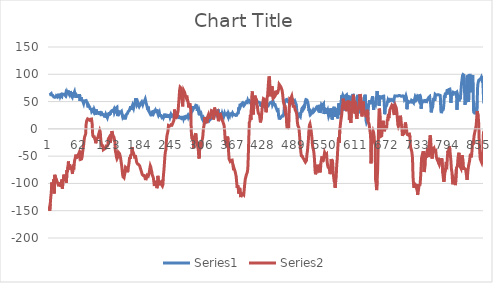
| Category | Series 0 | Series 1 |
|---|---|---|
| 0 | 62.28 | -142.32 |
| 1 | 62.648 | -150.01 |
| 2 | 62.867 | -137.33 |
| 3 | 61.117 | -125.26 |
| 4 | 64.64 | -116.98 |
| 5 | 61.934 | -98.28 |
| 6 | 62.05 | -110.44 |
| 7 | 61.359 | -102.49 |
| 8 | 61.095 | -98.646 |
| 9 | 58.376 | -92.328 |
| 10 | 58.526 | -118.26 |
| 11 | 57.778 | -84.271 |
| 12 | 58.745 | -88.879 |
| 13 | 58.365 | -89.514 |
| 14 | 60.553 | -91.845 |
| 15 | 60.092 | -95.366 |
| 16 | 58.664 | -97.365 |
| 17 | 60.737 | -98.933 |
| 18 | 60.391 | -103.06 |
| 19 | 59.159 | -102.01 |
| 20 | 61.324 | -102.83 |
| 21 | 64.49 | -98.06 |
| 22 | 59.574 | -103.23 |
| 23 | 61.543 | -105.94 |
| 24 | 63.131 | -97.44 |
| 25 | 59.436 | -92.788 |
| 26 | 63.87 | -109.57 |
| 27 | 65.043 | -98.49 |
| 28 | 63.443 | -91.665 |
| 29 | 63.753 | -83.82 |
| 30 | 63.212 | -95.491 |
| 31 | 62.579 | -84.628 |
| 32 | 60.91 | -89.293 |
| 33 | 65.677 | -96.152 |
| 34 | 63.731 | -98.567 |
| 35 | 67.161 | -75.378 |
| 36 | 64.594 | -79.419 |
| 37 | 70.132 | -69.179 |
| 38 | 66.034 | -59.672 |
| 39 | 66.528 | -74.001 |
| 40 | 62.496 | -64.739 |
| 41 | 65.641 | -71.165 |
| 42 | 69.35 | -74.382 |
| 43 | 61.67 | -68.678 |
| 44 | 63.27 | -71.902 |
| 45 | 58.746 | -72.45 |
| 46 | 67.473 | -82.631 |
| 47 | 66.296 | -69.305 |
| 48 | 62.751 | -68.026 |
| 49 | 63.962 | -70.844 |
| 50 | 67.657 | -58.702 |
| 51 | 62.659 | -55.294 |
| 52 | 66 | -51.391 |
| 53 | 56.925 | -47.227 |
| 54 | 61.737 | -54.105 |
| 55 | 61.958 | -50.639 |
| 56 | 59.804 | -51.267 |
| 57 | 59.608 | -48.452 |
| 58 | 60.313 | -46.984 |
| 59 | 57.155 | -43.952 |
| 60 | 63.628 | -49.781 |
| 61 | 51.088 | -47.753 |
| 62 | 54.416 | -55.959 |
| 63 | 58.1 | -57.364 |
| 64 | 53.517 | -55.146 |
| 65 | 52.411 | -51.344 |
| 66 | 51.78 | -43.152 |
| 67 | 50.835 | -36.521 |
| 68 | 46.575 | -29.591 |
| 69 | 50.916 | -20.626 |
| 70 | 51.882 | -14.56 |
| 71 | 51.481 | -12.185 |
| 72 | 50.421 | -9.234 |
| 73 | 51.974 | 8.098 |
| 74 | 49.672 | 14.497 |
| 75 | 46.607 | 15.376 |
| 76 | 47.264 | 18.253 |
| 77 | 39.145 | 17.669 |
| 78 | 43.038 | 17.189 |
| 79 | 43.189 | 16.139 |
| 80 | 39.631 | 15.511 |
| 81 | 36.696 | 14.273 |
| 82 | 37.431 | 15.082 |
| 83 | 35.934 | 20.236 |
| 84 | 31.906 | 15.936 |
| 85 | 31.928 | 8.523 |
| 86 | 34.6 | -11.629 |
| 87 | 33.644 | -13.964 |
| 88 | 31.007 | -13.912 |
| 89 | 35.465 | -14.226 |
| 90 | 33.218 | -18.291 |
| 91 | 26.067 | -20.266 |
| 92 | 29.166 | -26.378 |
| 93 | 35.59 | -22.7 |
| 94 | 30.997 | -17.817 |
| 95 | 30.857 | -17.616 |
| 96 | 28.876 | -16.337 |
| 97 | 29.819 | -14.818 |
| 98 | 28.808 | -9.296 |
| 99 | 25.698 | -9.798 |
| 100 | 32.481 | -2.926 |
| 101 | 33.136 | -5.747 |
| 102 | 26.976 | -20.139 |
| 103 | 26.933 | -26.646 |
| 104 | 28.461 | -30.57 |
| 105 | 26.148 | -30.702 |
| 106 | 25.423 | -30.996 |
| 107 | 26.377 | -38.237 |
| 108 | 26.264 | -39.655 |
| 109 | 22.958 | -36.945 |
| 110 | 24.11 | -36.432 |
| 111 | 22.729 | -35.872 |
| 112 | 26.355 | -33.761 |
| 113 | 24.169 | -31.246 |
| 114 | 24.698 | -31.072 |
| 115 | 20.205 | -31.347 |
| 116 | 23.282 | -29.386 |
| 117 | 28.717 | -18.224 |
| 118 | 24.016 | -16.889 |
| 119 | 30.674 | -15.058 |
| 120 | 25.929 | -18.01 |
| 121 | 27.575 | -24.974 |
| 122 | 31.618 | -23.543 |
| 123 | 30.812 | -12.768 |
| 124 | 33.299 | -4.034 |
| 125 | 32.987 | -4.834 |
| 126 | 32.092 | -12.463 |
| 127 | 32.827 | -11.307 |
| 128 | 35.739 | -14.909 |
| 129 | 30.029 | -19.476 |
| 130 | 31.283 | -25.126 |
| 131 | 34.497 | -41.905 |
| 132 | 37.973 | -44.857 |
| 133 | 36.292 | -52.017 |
| 134 | 39.596 | -54.899 |
| 135 | 25.792 | -54.632 |
| 136 | 25.02 | -50.977 |
| 137 | 25.447 | -42.959 |
| 138 | 27.449 | -44.439 |
| 139 | 31.144 | -45.097 |
| 140 | 32.343 | -48.413 |
| 141 | 30.178 | -52.384 |
| 142 | 28.819 | -52.828 |
| 143 | 32.044 | -65.23 |
| 144 | 27.67 | -72.482 |
| 145 | 23.467 | -81.886 |
| 146 | 26.045 | -87.697 |
| 147 | 19.607 | -89.014 |
| 148 | 21.314 | -89.714 |
| 149 | 19.586 | -90.993 |
| 150 | 20.496 | -80.041 |
| 151 | 19.527 | -70.241 |
| 152 | 19.678 | -69.136 |
| 153 | 26.954 | -71.839 |
| 154 | 25.767 | -75.866 |
| 155 | 28.371 | -79.477 |
| 156 | 31.505 | -74.078 |
| 157 | 32.987 | -73.416 |
| 158 | 32.988 | -61.813 |
| 159 | 33.92 | -52.344 |
| 160 | 37.547 | -54.983 |
| 161 | 41.301 | -48.445 |
| 162 | 34.864 | -46.925 |
| 163 | 37.603 | -46.598 |
| 164 | 41.277 | -33.246 |
| 165 | 43.812 | -45.257 |
| 166 | 42.706 | -42.685 |
| 167 | 38.227 | -44.893 |
| 168 | 42.498 | -44.903 |
| 169 | 40.989 | -51.71 |
| 170 | 48.611 | -51.136 |
| 171 | 56.051 | -51.102 |
| 172 | 47.588 | -55.491 |
| 173 | 44.354 | -61.268 |
| 174 | 45.631 | -62.822 |
| 175 | 49.176 | -64.516 |
| 176 | 46.262 | -65.885 |
| 177 | 42.73 | -65.449 |
| 178 | 40.703 | -66.702 |
| 179 | 40.241 | -67.896 |
| 180 | 44.133 | -68.859 |
| 181 | 46.69 | -74.098 |
| 182 | 47.816 | -74.153 |
| 183 | 49.397 | -80.156 |
| 184 | 46.885 | -83.527 |
| 185 | 44.376 | -84.349 |
| 186 | 47.403 | -85.555 |
| 187 | 48.865 | -86.449 |
| 188 | 49.981 | -85.42 |
| 189 | 48.474 | -88.347 |
| 190 | 54.599 | -91.526 |
| 191 | 50.743 | -91.277 |
| 192 | 46.14 | -91.702 |
| 193 | 43.189 | -88.153 |
| 194 | 39.229 | -85.009 |
| 195 | 34.577 | -83.588 |
| 196 | 40.611 | -86.494 |
| 197 | 32.538 | -83.48 |
| 198 | 32.527 | -79.354 |
| 199 | 29.281 | -72.786 |
| 200 | 28.934 | -67.689 |
| 201 | 25.435 | -70.084 |
| 202 | 26.723 | -75.116 |
| 203 | 25.56 | -79.244 |
| 204 | 31.284 | -84.875 |
| 205 | 30.766 | -84.067 |
| 206 | 32.124 | -89.124 |
| 207 | 29.05 | -96.506 |
| 208 | 31.033 | -104.77 |
| 209 | 30.33 | -103.66 |
| 210 | 34.336 | -97.544 |
| 211 | 33.725 | -97.761 |
| 212 | 29.28 | -97.03 |
| 213 | 35.346 | -108.72 |
| 214 | 32.216 | -105.43 |
| 215 | 27.496 | -86.108 |
| 216 | 24.985 | -95.76 |
| 217 | 25.332 | -97.158 |
| 218 | 29.557 | -97.305 |
| 219 | 24.548 | -99.702 |
| 220 | 22.83 | -101.29 |
| 221 | 24.56 | -97.793 |
| 222 | 25.078 | -101.96 |
| 223 | 20.852 | -102.83 |
| 224 | 21.118 | -104.88 |
| 225 | 22.636 | -102.12 |
| 226 | 20.438 | -85.521 |
| 227 | 22.67 | -75.429 |
| 228 | 25.216 | -62.818 |
| 229 | 27.795 | -48.639 |
| 230 | 20.542 | -41.325 |
| 231 | 24.34 | -37.624 |
| 232 | 22.925 | -20.575 |
| 233 | 23.89 | -12.304 |
| 234 | 20.92 | -11.608 |
| 235 | 25.802 | -3.912 |
| 236 | 20.116 | 6.173 |
| 237 | 27.243 | 5.099 |
| 238 | 26.218 | 5.216 |
| 239 | 21.105 | 4.818 |
| 240 | 22.267 | 5.686 |
| 241 | 26.863 | 7.551 |
| 242 | 26.217 | 8.202 |
| 243 | 23.465 | 6.946 |
| 244 | 23.731 | 9.332 |
| 245 | 24.871 | 11.548 |
| 246 | 22.797 | 13.962 |
| 247 | 24.179 | 16.672 |
| 248 | 25.054 | 35.425 |
| 249 | 22.867 | 27.223 |
| 250 | 31.631 | 18.135 |
| 251 | 32.089 | 22.294 |
| 252 | 23.592 | 22.058 |
| 253 | 25.006 | 22.805 |
| 254 | 22.141 | 28.426 |
| 255 | 21.324 | 32.493 |
| 256 | 22.43 | 32.72 |
| 257 | 18.02 | 56.898 |
| 258 | 21.219 | 70.459 |
| 259 | 21.014 | 76.366 |
| 260 | 21.106 | 76.186 |
| 261 | 20.252 | 74.366 |
| 262 | 18.746 | 67.126 |
| 263 | 18.629 | 53.879 |
| 264 | 19.411 | 41.21 |
| 265 | 23.776 | 58.824 |
| 266 | 19.091 | 70.499 |
| 267 | 21.727 | 70.053 |
| 268 | 22.05 | 66.763 |
| 269 | 22.569 | 62.903 |
| 270 | 19.897 | 61.42 |
| 271 | 18.561 | 57.487 |
| 272 | 21.566 | 60.955 |
| 273 | 22.763 | 55.439 |
| 274 | 24.444 | 54.54 |
| 275 | 21.532 | 48.719 |
| 276 | 24.192 | 39.199 |
| 277 | 24.134 | 39.116 |
| 278 | 21.335 | 46.67 |
| 279 | 22.498 | 45.213 |
| 280 | 24.456 | 36.781 |
| 281 | 29.96 | -1.42 |
| 282 | 31.618 | -16.396 |
| 283 | 32.181 | -18.503 |
| 284 | 34.428 | -19.986 |
| 285 | 41.508 | -21.063 |
| 286 | 37.676 | -35.634 |
| 287 | 39.069 | -16.509 |
| 288 | 39.343 | -12.267 |
| 289 | 40.54 | -12.381 |
| 290 | 43.26 | -8.232 |
| 291 | 42.325 | -18.814 |
| 292 | 42.603 | -23.808 |
| 293 | 33.138 | -29.105 |
| 294 | 38.33 | -32.996 |
| 295 | 33.644 | -38.249 |
| 296 | 35.726 | -52.342 |
| 297 | 32.206 | -54.331 |
| 298 | 24.801 | -30.7 |
| 299 | 32.886 | -24.055 |
| 300 | 29.177 | -35.761 |
| 301 | 25.239 | -34.607 |
| 302 | 21.174 | -22.777 |
| 303 | 18.008 | -19.212 |
| 304 | 18.676 | -13.455 |
| 305 | 14.566 | -1.159 |
| 306 | 18.515 | -0.607 |
| 307 | 16.374 | 10.898 |
| 308 | 14.91 | 21.737 |
| 309 | 13.229 | 14.043 |
| 310 | 15.139 | 13.891 |
| 311 | 20.624 | 13.795 |
| 312 | 16.647 | 10.44 |
| 313 | 18.768 | 19.288 |
| 314 | 16.708 | 23.219 |
| 315 | 16.776 | 25.732 |
| 316 | 15.016 | 24.463 |
| 317 | 15.843 | 17.957 |
| 318 | 19.412 | 21.136 |
| 319 | 17.259 | 25.884 |
| 320 | 16.143 | 28.639 |
| 321 | 19.127 | 33.366 |
| 322 | 19.448 | 33.77 |
| 323 | 20.208 | 32.386 |
| 324 | 23.201 | 26.804 |
| 325 | 23.465 | 17.162 |
| 326 | 23.028 | 21.805 |
| 327 | 26.886 | 39.104 |
| 328 | 27.888 | 35.938 |
| 329 | 29.983 | 28.18 |
| 330 | 29.43 | 28.614 |
| 331 | 25.918 | 26.77 |
| 332 | 27.841 | 25.828 |
| 333 | 29.695 | 29.786 |
| 334 | 35.878 | 19.158 |
| 335 | 30.086 | 14.041 |
| 336 | 30.374 | 13.646 |
| 337 | 25.827 | 21.442 |
| 338 | 30.604 | 29.145 |
| 339 | 25.389 | 25.909 |
| 340 | 23.811 | 23.814 |
| 341 | 24.423 | 20.429 |
| 342 | 27.943 | 20.605 |
| 343 | 24.72 | 14.457 |
| 344 | 23.522 | 12.301 |
| 345 | 21.692 | 9.071 |
| 346 | 25.193 | 6.794 |
| 347 | 28.302 | -2.625 |
| 348 | 25.515 | -17.268 |
| 349 | 26.759 | -24.003 |
| 350 | 26.263 | -26.563 |
| 351 | 26.575 | -25.504 |
| 352 | 28.153 | -17.814 |
| 353 | 23.959 | -14.074 |
| 354 | 21.852 | -20.314 |
| 355 | 28.21 | -42.193 |
| 356 | 27.725 | -55.207 |
| 357 | 24.619 | -55.192 |
| 358 | 29.555 | -59.415 |
| 359 | 26.909 | -58.56 |
| 360 | 27.91 | -57.53 |
| 361 | 28.221 | -58.112 |
| 362 | 26.137 | -57.22 |
| 363 | 28.901 | -57.116 |
| 364 | 28.291 | -69.385 |
| 365 | 25.618 | -75.876 |
| 366 | 26.435 | -72.903 |
| 367 | 26.032 | -71.224 |
| 368 | 25.447 | -78.487 |
| 369 | 24.558 | -77.379 |
| 370 | 26.103 | -87.359 |
| 371 | 25.007 | -98.643 |
| 372 | 27.955 | -108.33 |
| 373 | 28.21 | -103.3 |
| 374 | 28.912 | -107.73 |
| 375 | 39.624 | -118.68 |
| 376 | 37.364 | -113.95 |
| 377 | 41.047 | -108.11 |
| 378 | 46.022 | -109.8 |
| 379 | 42.393 | -125 |
| 380 | 44.893 | -123.24 |
| 381 | 44.952 | -118.92 |
| 382 | 47.07 | -119.22 |
| 383 | 48.784 | -118.55 |
| 384 | 43.605 | -117.86 |
| 385 | 45.573 | -120.59 |
| 386 | 43.604 | -120.49 |
| 387 | 43.112 | -100.3 |
| 388 | 46.24 | -92.108 |
| 389 | 45.621 | -91.589 |
| 390 | 49.591 | -84.697 |
| 391 | 49.085 | -85.672 |
| 392 | 48.463 | -79.386 |
| 393 | 52.299 | -73.213 |
| 394 | 50.13 | -48.572 |
| 395 | 51.467 | -15.352 |
| 396 | 51.514 | 11.814 |
| 397 | 51.516 | 13.764 |
| 398 | 47.67 | 24.885 |
| 399 | 47.347 | 16.418 |
| 400 | 45.307 | 33.922 |
| 401 | 46.139 | 60.321 |
| 402 | 46.988 | 68.585 |
| 403 | 45.72 | 46.104 |
| 404 | 46.597 | 26.268 |
| 405 | 45.121 | 45.395 |
| 406 | 45.701 | 48.381 |
| 407 | 45.541 | 60.915 |
| 408 | 45.998 | 57.817 |
| 409 | 49.006 | 57.545 |
| 410 | 49.788 | 54.06 |
| 411 | 50.973 | 45.588 |
| 412 | 51.826 | 41.243 |
| 413 | 49.233 | 32.952 |
| 414 | 49.936 | 28.217 |
| 415 | 48.669 | 27.435 |
| 416 | 50.5 | 26.679 |
| 417 | 47.739 | 18.868 |
| 418 | 49.465 | 11.78 |
| 419 | 41.266 | 11.036 |
| 420 | 45.941 | 21.462 |
| 421 | 40.366 | 34.122 |
| 422 | 43.948 | 45.392 |
| 423 | 41.082 | 50.05 |
| 424 | 41.292 | 55.32 |
| 425 | 40.875 | 55.592 |
| 426 | 43.203 | 54.159 |
| 427 | 39.815 | 47.203 |
| 428 | 38.984 | 39.648 |
| 429 | 41.46 | 30.403 |
| 430 | 40.898 | 34.261 |
| 431 | 40.093 | 56.491 |
| 432 | 40.298 | 59.469 |
| 433 | 41.644 | 72.22 |
| 434 | 43.234 | 86.395 |
| 435 | 45.412 | 96.095 |
| 436 | 46.231 | 93.562 |
| 437 | 47.808 | 75.398 |
| 438 | 49.06 | 59.588 |
| 439 | 48.634 | 58.391 |
| 440 | 49.672 | 69.71 |
| 441 | 49.775 | 78.317 |
| 442 | 43.993 | 61.153 |
| 443 | 44.399 | 55.828 |
| 444 | 47.796 | 57.041 |
| 445 | 44.903 | 57.744 |
| 446 | 45.206 | 58.028 |
| 447 | 44.594 | 60.357 |
| 448 | 41.174 | 69.885 |
| 449 | 38.963 | 68.666 |
| 450 | 38.158 | 64.44 |
| 451 | 33.807 | 64.842 |
| 452 | 34.484 | 65.926 |
| 453 | 34.727 | 66.781 |
| 454 | 23.834 | 72.514 |
| 455 | 19.286 | 81.663 |
| 456 | 19.736 | 81.545 |
| 457 | 19.079 | 79.001 |
| 458 | 20.277 | 79.878 |
| 459 | 21.372 | 75.862 |
| 460 | 20.551 | 73.007 |
| 461 | 23.892 | 69.638 |
| 462 | 23.283 | 63.02 |
| 463 | 23.741 | 52.875 |
| 464 | 25.639 | 47.295 |
| 465 | 35.983 | 43.817 |
| 466 | 48.406 | 42.332 |
| 467 | 46.609 | 32.707 |
| 468 | 53.093 | 34.643 |
| 469 | 54.718 | 27.152 |
| 470 | 53.909 | 7.287 |
| 471 | 53.011 | -0.108 |
| 472 | 50.282 | 2.382 |
| 473 | 50.867 | 3.124 |
| 474 | 51.377 | 3.159 |
| 475 | 51.018 | 35.949 |
| 476 | 49.704 | 53.045 |
| 477 | 52.124 | 53.933 |
| 478 | 49.2 | 50.661 |
| 479 | 47.715 | 57.591 |
| 480 | 50.005 | 59.936 |
| 481 | 47.53 | 54.17 |
| 482 | 47.887 | 50.548 |
| 483 | 50.996 | 41.291 |
| 484 | 49.003 | 40.737 |
| 485 | 49.777 | 41.27 |
| 486 | 51.408 | 38.104 |
| 487 | 50.317 | 34.237 |
| 488 | 46.265 | 32.71 |
| 489 | 44.386 | 30.445 |
| 490 | 32.045 | 25.614 |
| 491 | 28.554 | 13.202 |
| 492 | 26.598 | 6.348 |
| 493 | 22.417 | 7.662 |
| 494 | 23.915 | 2.432 |
| 495 | 25.595 | -6.325 |
| 496 | 24.595 | -19.087 |
| 497 | 22.762 | -32.83 |
| 498 | 29.086 | -42.78 |
| 499 | 31.641 | -49.511 |
| 500 | 37.087 | -50.131 |
| 501 | 37.801 | -50.189 |
| 502 | 39.607 | -53.031 |
| 503 | 35.957 | -54.226 |
| 504 | 35.138 | -55.577 |
| 505 | 39.114 | -57.847 |
| 506 | 45.366 | -59.315 |
| 507 | 50.97 | -61.047 |
| 508 | 53.631 | -60.764 |
| 509 | 52.467 | -58.115 |
| 510 | 52.898 | -47.278 |
| 511 | 54.403 | -40.906 |
| 512 | 47.77 | -39.126 |
| 513 | 41.843 | -19.273 |
| 514 | 32.561 | -2.626 |
| 515 | 35.797 | 6.865 |
| 516 | 29.004 | 9.047 |
| 517 | 30.869 | 7.756 |
| 518 | 27.301 | -0.78 |
| 519 | 26.713 | -8.666 |
| 520 | 29.832 | -17.006 |
| 521 | 29.372 | -30.236 |
| 522 | 33.784 | -35.582 |
| 523 | 30.982 | -38.43 |
| 524 | 31.49 | -45.168 |
| 525 | 33.023 | -56.234 |
| 526 | 32.042 | -75.189 |
| 527 | 36.451 | -83.259 |
| 528 | 37.938 | -78.584 |
| 529 | 39.391 | -72.403 |
| 530 | 39.237 | -65.759 |
| 531 | 37.063 | -72.608 |
| 532 | 35.2 | -75.355 |
| 533 | 37.666 | -74.061 |
| 534 | 44.007 | -70.882 |
| 535 | 36.546 | -69.165 |
| 536 | 29.224 | -79.797 |
| 537 | 28.176 | -72.284 |
| 538 | 36.062 | -59.589 |
| 539 | 44.973 | -57.794 |
| 540 | 44.858 | -50.457 |
| 541 | 43.385 | -60.625 |
| 542 | 42.119 | -58.844 |
| 543 | 45.768 | -55.753 |
| 544 | 27.459 | -49.418 |
| 545 | 38.609 | -43.449 |
| 546 | 39.85 | -45.709 |
| 547 | 27.299 | -49.038 |
| 548 | 38.167 | -47.327 |
| 549 | 28.889 | -46.746 |
| 550 | 28.487 | -59.504 |
| 551 | 33.714 | -66.814 |
| 552 | 34.417 | -70.554 |
| 553 | 23.272 | -69.108 |
| 554 | 25.749 | -71.862 |
| 555 | 37.328 | -72.932 |
| 556 | 22.143 | -82.962 |
| 557 | 24.467 | -71.872 |
| 558 | 26.425 | -55.22 |
| 559 | 37.951 | -60.264 |
| 560 | 17.236 | -56.768 |
| 561 | 24.802 | -61.817 |
| 562 | 35.553 | -79.956 |
| 563 | 36.509 | -88.584 |
| 564 | 40.439 | -96.868 |
| 565 | 21.864 | -94.234 |
| 566 | 35.383 | -107.88 |
| 567 | 37.592 | -95.29 |
| 568 | 21.692 | -87.966 |
| 569 | 35.027 | -65.865 |
| 570 | 27.599 | -55.277 |
| 571 | 19.123 | -37.105 |
| 572 | 38.31 | -20.618 |
| 573 | 46.677 | -15.824 |
| 574 | 26.227 | -25.982 |
| 575 | 30.685 | -3.24 |
| 576 | 47.092 | -2.074 |
| 577 | 39.624 | 14.499 |
| 578 | 38.388 | 20.169 |
| 579 | 61.553 | 26.926 |
| 580 | 58.446 | 41.845 |
| 581 | 61.566 | 44.374 |
| 582 | 59.309 | 55.216 |
| 583 | 58.423 | 35.713 |
| 584 | 33.585 | 48.162 |
| 585 | 57.882 | 49.536 |
| 586 | 60.242 | 40.683 |
| 587 | 60.83 | 49.915 |
| 588 | 61.841 | 39.065 |
| 589 | 40.839 | 32.301 |
| 590 | 53.724 | 48.418 |
| 591 | 57.674 | 44.459 |
| 592 | 55.74 | 51.747 |
| 593 | 59.137 | 40.957 |
| 594 | 60.23 | 16.547 |
| 595 | 58.687 | 20.688 |
| 596 | 43.271 | 16.095 |
| 597 | 39.827 | 10.874 |
| 598 | 48.071 | 28.337 |
| 599 | 53.851 | 51.092 |
| 600 | 53.897 | 44.661 |
| 601 | 64.019 | 51.597 |
| 602 | 62.36 | 62.445 |
| 603 | 58.353 | 63.503 |
| 604 | 31.951 | 42.942 |
| 605 | 45.032 | 27.912 |
| 606 | 45.204 | 49.751 |
| 607 | 46.769 | 32.03 |
| 608 | 48.187 | 21.916 |
| 609 | 50.869 | 18.464 |
| 610 | 59.782 | 32.575 |
| 611 | 62.303 | 33.459 |
| 612 | 41.819 | 37.192 |
| 613 | 28.59 | 37.395 |
| 614 | 34.001 | 49.729 |
| 615 | 34.023 | 63.661 |
| 616 | 37.512 | 59.341 |
| 617 | 43.374 | 56.804 |
| 618 | 47.623 | 38.435 |
| 619 | 49.371 | 22.81 |
| 620 | 47.058 | 38.369 |
| 621 | 45.664 | 50.162 |
| 622 | 47.876 | 45.097 |
| 623 | 54.334 | 31.395 |
| 624 | 54.38 | 28.67 |
| 625 | 62.568 | 29.43 |
| 626 | 56.823 | 29.911 |
| 627 | 15.362 | 21.21 |
| 628 | 11.321 | 20.889 |
| 629 | 12.929 | 28.33 |
| 630 | 15.208 | 34.906 |
| 631 | 30.443 | 13.648 |
| 632 | 44.26 | 12.984 |
| 633 | 46.459 | 9.072 |
| 634 | 52.527 | 2.144 |
| 635 | 47.311 | 2.54 |
| 636 | 48.163 | -11.861 |
| 637 | 47.323 | -63.243 |
| 638 | 47.196 | -20.724 |
| 639 | 56.132 | -10.449 |
| 640 | 59.598 | -8.077 |
| 641 | 46.254 | -3.997 |
| 642 | 34.692 | -6.685 |
| 643 | 46.195 | -13.415 |
| 644 | 47.738 | -26.048 |
| 645 | 48.037 | -28.599 |
| 646 | 45.907 | -94.118 |
| 647 | 52.009 | -100.51 |
| 648 | 60.921 | -112.22 |
| 649 | 69.373 | -95.227 |
| 650 | 55.266 | -75.713 |
| 651 | 56.708 | -33.182 |
| 652 | 61.336 | 11.925 |
| 653 | 42.291 | 37.141 |
| 654 | 57.58 | 34.925 |
| 655 | 56.453 | 22.915 |
| 656 | 58.618 | -13.939 |
| 657 | 59.931 | -15.149 |
| 658 | 56.994 | -12.75 |
| 659 | 57.756 | -3.25 |
| 660 | 59.563 | 4.777 |
| 661 | 57.962 | 14.851 |
| 662 | 59.966 | 0.848 |
| 663 | 47.369 | -4.358 |
| 664 | 26.898 | -2.554 |
| 665 | 38.919 | 1.004 |
| 666 | 39.137 | 6.192 |
| 667 | 41.565 | -0.053 |
| 668 | 43.695 | 3.446 |
| 669 | 45.03 | 16.902 |
| 670 | 51.275 | 14.366 |
| 671 | 48.384 | 24.03 |
| 672 | 54.185 | 24.385 |
| 673 | 52.953 | 23.224 |
| 674 | 54.175 | 34.288 |
| 675 | 52.757 | 36.423 |
| 676 | 52.02 | 37.994 |
| 677 | 51.767 | 40.821 |
| 678 | 53.622 | 37.392 |
| 679 | 52.055 | 38.952 |
| 680 | 52.331 | 45.778 |
| 681 | 53.161 | 45.01 |
| 682 | 50.408 | 28.964 |
| 683 | 57.133 | 25.442 |
| 684 | 60.345 | 37.866 |
| 685 | 62.027 | 42.622 |
| 686 | 60.023 | 42.891 |
| 687 | 60.621 | 37.866 |
| 688 | 60.195 | 30.408 |
| 689 | 59.263 | 19.601 |
| 690 | 60.231 | 7.511 |
| 691 | 58.652 | 4.18 |
| 692 | 61.231 | 4.71 |
| 693 | 61.451 | 8.94 |
| 694 | 60.933 | 14.761 |
| 695 | 59.689 | 24.091 |
| 696 | 59.885 | 17.638 |
| 697 | 60.748 | 16.051 |
| 698 | 59.896 | 0.239 |
| 699 | 61.566 | -12.788 |
| 700 | 60.53 | -9.358 |
| 701 | 58.826 | -10.301 |
| 702 | 59.517 | -8.902 |
| 703 | 54.438 | -6.973 |
| 704 | 52.919 | 6.456 |
| 705 | 57.628 | 11.642 |
| 706 | 60.438 | 4.788 |
| 707 | 56.984 | 1.344 |
| 708 | 36.025 | -8.22 |
| 709 | 48.106 | -10.658 |
| 710 | 50.467 | -11.182 |
| 711 | 50.155 | -11.43 |
| 712 | 48.462 | -7.242 |
| 713 | 48.901 | -7.385 |
| 714 | 49.695 | -14.868 |
| 715 | 50.04 | -33.026 |
| 716 | 49.188 | -34.163 |
| 717 | 52.079 | -39.56 |
| 718 | 50.328 | -44.491 |
| 719 | 50.329 | -53.436 |
| 720 | 49.511 | -87.27 |
| 721 | 47.944 | -100.54 |
| 722 | 54.381 | -107.9 |
| 723 | 51.353 | -99.136 |
| 724 | 56.603 | -102.26 |
| 725 | 54.346 | -100.66 |
| 726 | 57.305 | -106.8 |
| 727 | 54.796 | -101.46 |
| 728 | 56.385 | -105.8 |
| 729 | 58.492 | -120.93 |
| 730 | 58.827 | -117.3 |
| 731 | 53.944 | -116.69 |
| 732 | 60.633 | -103.45 |
| 733 | 58.883 | -104.02 |
| 734 | 61.226 | -102.09 |
| 735 | 59.067 | -88.555 |
| 736 | 36.816 | -71.186 |
| 737 | 45.007 | -52.974 |
| 738 | 48.273 | -48.955 |
| 739 | 51.038 | -51.378 |
| 740 | 52.102 | -47.656 |
| 741 | 50.115 | -40.967 |
| 742 | 50 | -79.074 |
| 743 | 51.165 | -73.683 |
| 744 | 54.448 | -66.77 |
| 745 | 50.647 | -44.638 |
| 746 | 47.379 | -46.466 |
| 747 | 52.721 | -52.489 |
| 748 | 51.036 | -40.871 |
| 749 | 53.47 | -35.233 |
| 750 | 55.398 | -39.543 |
| 751 | 57.483 | -51.741 |
| 752 | 56.577 | -27.663 |
| 753 | 59.183 | -18.925 |
| 754 | 59.844 | -11.878 |
| 755 | 44.387 | -18.813 |
| 756 | 30.211 | -38.516 |
| 757 | 34.701 | -50.609 |
| 758 | 33.305 | -54.44 |
| 759 | 40.587 | -43.838 |
| 760 | 50.532 | -32.888 |
| 761 | 56.908 | -39.301 |
| 762 | 57.656 | -37.038 |
| 763 | 51.338 | -40.516 |
| 764 | 63.199 | -41.923 |
| 765 | 62.622 | -39.655 |
| 766 | 61.658 | -49.653 |
| 767 | 62.152 | -54.615 |
| 768 | 62.324 | -55.358 |
| 769 | 62.275 | -58.646 |
| 770 | 62.399 | -52.892 |
| 771 | 62.867 | -62.778 |
| 772 | 62.201 | -65.209 |
| 773 | 62.447 | -61.484 |
| 774 | 61.239 | -58.726 |
| 775 | 34.74 | -59.578 |
| 776 | 28.842 | -58.209 |
| 777 | 30.373 | -53.879 |
| 778 | 35.205 | -54.706 |
| 779 | 33.848 | -81.156 |
| 780 | 35.801 | -90.197 |
| 781 | 43.94 | -97.024 |
| 782 | 60.942 | -91.004 |
| 783 | 56.772 | -80.672 |
| 784 | 64.372 | -77.219 |
| 785 | 66.073 | -66.337 |
| 786 | 64.791 | -66.868 |
| 787 | 65.976 | -68.659 |
| 788 | 72.49 | -52.22 |
| 789 | 67.58 | -40.061 |
| 790 | 63.187 | -45.037 |
| 791 | 72.159 | -37.959 |
| 792 | 73.333 | -31.973 |
| 793 | 72.815 | -38.724 |
| 794 | 67.635 | -37.582 |
| 795 | 47.703 | -58.571 |
| 796 | 64.593 | -73.767 |
| 797 | 65.458 | -79.351 |
| 798 | 63.819 | -93.155 |
| 799 | 61.314 | -101.57 |
| 800 | 67.097 | -89.568 |
| 801 | 66.321 | -90.087 |
| 802 | 66.149 | -93.301 |
| 803 | 64.422 | -99.663 |
| 804 | 65.978 | -103.08 |
| 805 | 65.717 | -104.49 |
| 806 | 67.27 | -71.605 |
| 807 | 35.055 | -72.707 |
| 808 | 56.824 | -68.196 |
| 809 | 60.62 | -53.368 |
| 810 | 57.516 | -47.947 |
| 811 | 50.438 | -43.771 |
| 812 | 61.832 | -62.178 |
| 813 | 54.233 | -68.651 |
| 814 | 59.068 | -67.003 |
| 815 | 60.278 | -72.368 |
| 816 | 83.072 | -62.07 |
| 817 | 90.155 | -48.466 |
| 818 | 97.585 | -52.656 |
| 819 | 99.482 | -58.263 |
| 820 | 98.446 | -72.638 |
| 821 | 98.101 | -72.264 |
| 822 | 69.605 | -72.514 |
| 823 | 44.212 | -72.523 |
| 824 | 55.78 | -74.104 |
| 825 | 59.575 | -79.966 |
| 826 | 78.587 | -81.588 |
| 827 | 94.647 | -93.527 |
| 828 | 97.756 | -83.989 |
| 829 | 97.059 | -74.276 |
| 830 | 49.046 | -67.499 |
| 831 | 98.101 | -65.869 |
| 832 | 96.373 | -58.325 |
| 833 | 98.272 | -49.399 |
| 834 | 90.844 | -45.784 |
| 835 | 75.481 | -52.087 |
| 836 | 67.011 | -47.318 |
| 837 | 96.028 | -37.491 |
| 838 | 98.793 | -22.982 |
| 839 | 70.462 | -28.44 |
| 840 | 31.603 | -20.74 |
| 841 | 29.014 | -12.01 |
| 842 | 34.709 | -11.483 |
| 843 | 26.771 | -3.065 |
| 844 | 32.642 | 1.899 |
| 845 | 30.569 | 6.29 |
| 846 | 28.673 | 6.46 |
| 847 | 49.733 | 32.281 |
| 848 | 79.444 | 31.48 |
| 849 | 84.8 | 23.324 |
| 850 | 88.94 | 10.138 |
| 851 | 89.981 | -22.659 |
| 852 | 90.502 | -41.114 |
| 853 | 91.886 | -55.435 |
| 854 | 92.057 | -57.293 |
| 855 | 93.956 | -59.834 |
| 856 | 90.331 | -62.034 |
| 857 | 90.673 | -62.665 |
| 858 | 92.917 | -53.234 |
| 859 | 91.88 | -13.232 |
| 860 | 46.464 | -3.861 |